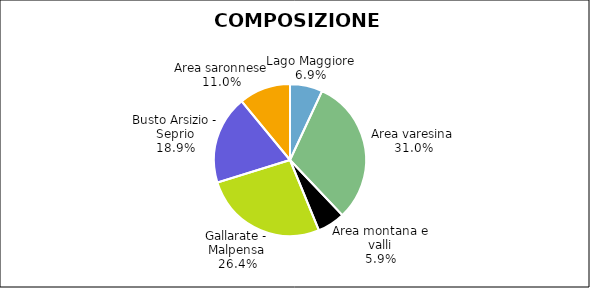
| Category | Series 0 |
|---|---|
| Lago Maggiore | 6303 |
| Area varesina | 28187 |
| Area montana e valli | 5340 |
| Gallarate - Malpensa | 24025 |
| Busto Arsizio - Seprio | 17132 |
| Area saronnese | 9963 |